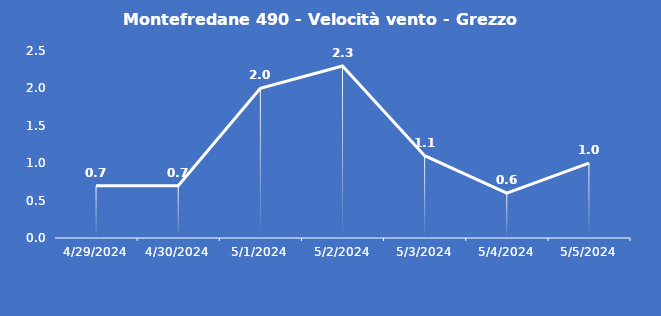
| Category | Montefredane 490 - Velocità vento - Grezzo (m/s) |
|---|---|
| 4/29/24 | 0.7 |
| 4/30/24 | 0.7 |
| 5/1/24 | 2 |
| 5/2/24 | 2.3 |
| 5/3/24 | 1.1 |
| 5/4/24 | 0.6 |
| 5/5/24 | 1 |